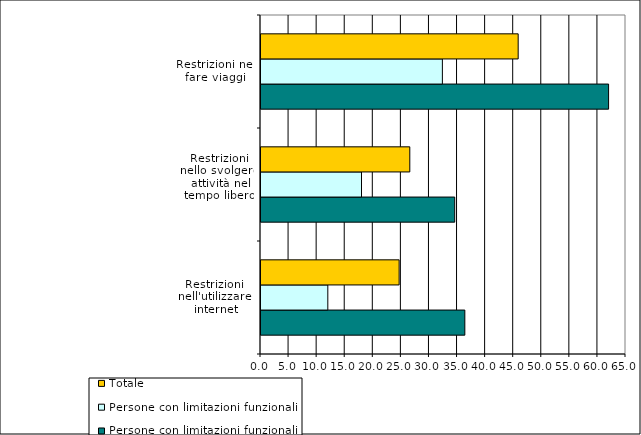
| Category | Persone con limitazioni funzionali gravi | Persone con limitazioni funzionali lievi | Totale |
|---|---|---|---|
| Restrizioni nell'utilizzare
 internet | 36.3 | 11.9 | 24.6 |
| Restrizioni nello svolgere
 attività nel tempo libero | 34.5 | 17.9 | 26.5 |
| Restrizioni nel fare viaggi | 61.9 | 32.3 | 45.8 |